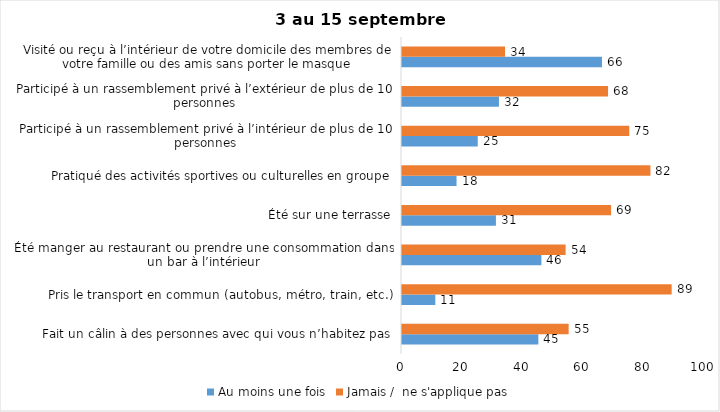
| Category | Au moins une fois | Jamais /  ne s'applique pas |
|---|---|---|
| Fait un câlin à des personnes avec qui vous n’habitez pas | 45 | 55 |
| Pris le transport en commun (autobus, métro, train, etc.) | 11 | 89 |
| Été manger au restaurant ou prendre une consommation dans un bar à l’intérieur | 46 | 54 |
| Été sur une terrasse | 31 | 69 |
| Pratiqué des activités sportives ou culturelles en groupe | 18 | 82 |
| Participé à un rassemblement privé à l’intérieur de plus de 10 personnes | 25 | 75 |
| Participé à un rassemblement privé à l’extérieur de plus de 10 personnes | 32 | 68 |
| Visité ou reçu à l’intérieur de votre domicile des membres de votre famille ou des amis sans porter le masque | 66 | 34 |